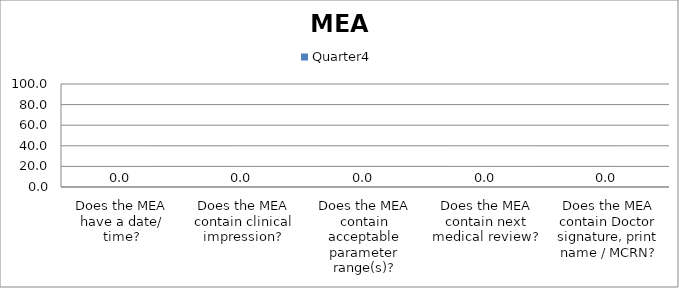
| Category | Quarter4 |
|---|---|
| Does the MEA have a date/ time? | 0 |
| Does the MEA contain clinical impression? | 0 |
| Does the MEA contain acceptable parameter range(s)? | 0 |
| Does the MEA contain next medical review? | 0 |
| Does the MEA contain Doctor signature, print name / MCRN? | 0 |